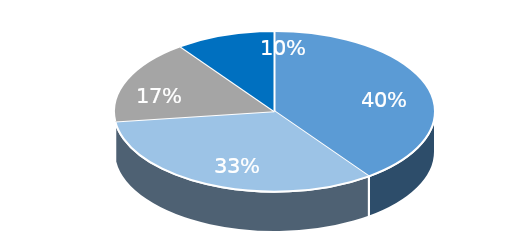
| Category | Series 0 |
|---|---|
| > 100K | 0.4 |
| < 10K | 0.33 |
| 10K - 50K | 0.17 |
| 50K - 100K | 0.1 |